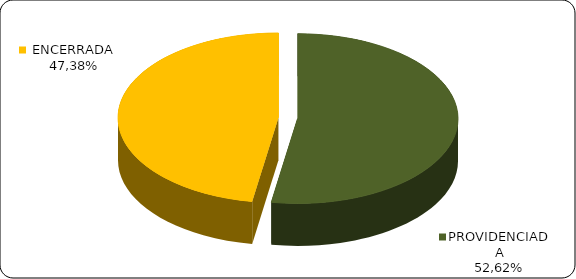
| Category | Series 0 |
|---|---|
|      PROVIDENCIADA | 0.526 |
|      ENCERRADA | 0.474 |